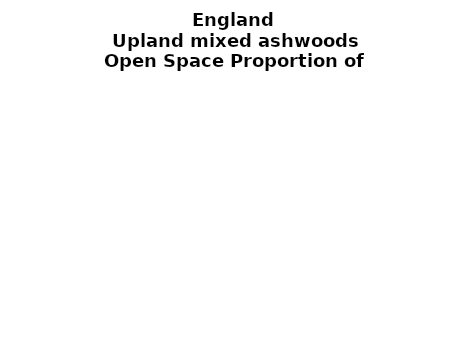
| Category | Upland mixed ashwoods |
|---|---|
|  ≥ 10ha, < 10%  | 0.253 |
|   ≥ 10ha, 10-25% | 0.074 |
|   ≥ 10ha, > 25 and <50%  | 0.1 |
|   ≥ 10ha, ≥ 50%  | 0.14 |
|  < 10ha, < 10% | 0.038 |
|  < 10ha, 10-25% | 0.068 |
|  < 10ha, > 25 and < 50% | 0.091 |
|  < 10ha, ≥ 50% | 0.236 |